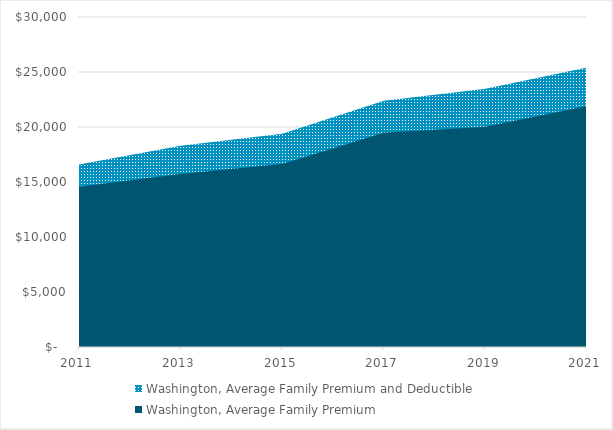
| Category | United States, Average Family Premium and Deductible | Alabama, Average Family Premium and Deductible | Alaska, Average Family Premium and Deductible | Arizona, Average Family Premium and Deductible | Arkansas, Average Family Premium and Deductible | California, Average Family Premium and Deductible | Colorado, Average Family Premium and Deductible | Connecticut, Average Family Premium and Deductible | Delaware, Average Family Premium and Deductible | District of Columbia, Average Family Premium and Deductible | Florida, Average Family Premium and Deductible | Georgia, Average Family Premium and Deductible | Hawaii, Average Family Premium and Deductible | Idaho, Average Family Premium and Deductible | Illinois, Average Family Premium and Deductible | Indiana, Average Family Premium and Deductible | Iowa, Average Family Premium and Deductible | Kansas, Average Family Premium and Deductible | Kentucky, Average Family Premium and Deductible | Louisiana, Average Family Premium and Deductible | Maine, Average Family Premium and Deductible | Maryland, Average Family Premium and Deductible | Massachusetts, Average Family Premium and Deductible | Michigan, Average Family Premium and Deductible | Minnesota, Average Family Premium and Deductible | Mississippi, Average Family Premium and Deductible | Missouri, Average Family Premium and Deductible | Montana, Average Family Premium and Deductible | Nebraska, Average Family Premium and Deductible | Nevada, Average Family Premium and Deductible | New Hampshire, Average Family Premium and Deductible | New Jersey, Average Family Premium and Deductible | New Mexico, Average Family Premium and Deductible | New York, Average Family Premium and Deductible | North Carolina, Average Family Premium and Deductible | North Dakota, Average Family Premium and Deductible | Ohio, Average Family Premium and Deductible | Oklahoma, Average Family Premium and Deductible | Oregon, Average Family Premium and Deductible | Pennsylvania, Average Family Premium and Deductible | Rhode Island, Average Family Premium and Deductible | South Carolina, Average Family Premium and Deductible | South Dakota, Average Family Premium and Deductible | Tennessee, Average Family Premium and Deductible | Texas, Average Family Premium and Deductible | Utah, Average Family Premium and Deductible | Vermont, Average Family Premium and Deductible | Virginia, Average Family Premium and Deductible | Washington, Average Family Premium and Deductible | West Virginia, Average Family Premium and Deductible | Wisconsin, Average Family Premium and Deductible | Wyoming, Average Family Premium and Deductible | United States, Average Family Premium | Alabama, Average Family Premium | Alaska, Average Family Premium | Arizona, Average Family Premium | Arkansas, Average Family Premium | California, Average Family Premium | Colorado, Average Family Premium | Connecticut, Average Family Premium | Delaware, Average Family Premium | District of Columbia, Average Family Premium | Florida, Average Family Premium | Georgia, Average Family Premium | Hawaii, Average Family Premium | Idaho, Average Family Premium | Illinois, Average Family Premium | Indiana, Average Family Premium | Iowa, Average Family Premium | Kansas, Average Family Premium | Kentucky, Average Family Premium | Louisiana, Average Family Premium | Maine, Average Family Premium | Maryland, Average Family Premium | Massachusetts, Average Family Premium | Michigan, Average Family Premium | Minnesota, Average Family Premium | Mississippi, Average Family Premium | Missouri, Average Family Premium | Montana, Average Family Premium | Nebraska, Average Family Premium | Nevada, Average Family Premium | New Hampshire, Average Family Premium | New Jersey, Average Family Premium | New Mexico, Average Family Premium | New York, Average Family Premium | North Carolina, Average Family Premium | North Dakota, Average Family Premium | Ohio, Average Family Premium | Oklahoma, Average Family Premium | Oregon, Average Family Premium | Pennsylvania, Average Family Premium | Rhode Island, Average Family Premium | South Carolina, Average Family Premium | South Dakota, Average Family Premium | Tennessee, Average Family Premium | Texas, Average Family Premium | Utah, Average Family Premium | Vermont, Average Family Premium | Virginia, Average Family Premium | Washington, Average Family Premium | West Virginia, Average Family Premium | Wisconsin, Average Family Premium | Wyoming, Average Family Premium |
|---|---|---|---|---|---|---|---|---|---|---|---|---|---|---|---|---|---|---|---|---|---|---|---|---|---|---|---|---|---|---|---|---|---|---|---|---|---|---|---|---|---|---|---|---|---|---|---|---|---|---|---|---|---|---|---|---|---|---|---|---|---|---|---|---|---|---|---|---|---|---|---|---|---|---|---|---|---|---|---|---|---|---|---|---|---|---|---|---|---|---|---|---|---|---|---|---|---|---|---|---|---|---|---|---|
| 2011.0 |  |  |  |  |  |  |  |  |  |  |  |  |  |  |  |  |  |  |  |  |  |  |  |  |  |  |  |  |  |  |  |  |  |  |  |  |  |  |  |  |  |  |  |  |  |  |  |  | 16580 |  |  |  |  |  |  |  |  |  |  |  |  |  |  |  |  |  |  |  |  |  |  |  |  |  |  |  |  |  |  |  |  |  |  |  |  |  |  |  |  |  |  |  |  |  |  |  |  |  |  |  | 14559 |  |  |  |
| 2013.0 |  |  |  |  |  |  |  |  |  |  |  |  |  |  |  |  |  |  |  |  |  |  |  |  |  |  |  |  |  |  |  |  |  |  |  |  |  |  |  |  |  |  |  |  |  |  |  |  | 18292 |  |  |  |  |  |  |  |  |  |  |  |  |  |  |  |  |  |  |  |  |  |  |  |  |  |  |  |  |  |  |  |  |  |  |  |  |  |  |  |  |  |  |  |  |  |  |  |  |  |  |  | 15721 |  |  |  |
| 2015.0 |  |  |  |  |  |  |  |  |  |  |  |  |  |  |  |  |  |  |  |  |  |  |  |  |  |  |  |  |  |  |  |  |  |  |  |  |  |  |  |  |  |  |  |  |  |  |  |  | 19378 |  |  |  |  |  |  |  |  |  |  |  |  |  |  |  |  |  |  |  |  |  |  |  |  |  |  |  |  |  |  |  |  |  |  |  |  |  |  |  |  |  |  |  |  |  |  |  |  |  |  |  | 16627 |  |  |  |
| 2017.0 |  |  |  |  |  |  |  |  |  |  |  |  |  |  |  |  |  |  |  |  |  |  |  |  |  |  |  |  |  |  |  |  |  |  |  |  |  |  |  |  |  |  |  |  |  |  |  |  | 22392 |  |  |  |  |  |  |  |  |  |  |  |  |  |  |  |  |  |  |  |  |  |  |  |  |  |  |  |  |  |  |  |  |  |  |  |  |  |  |  |  |  |  |  |  |  |  |  |  |  |  |  | 19472 |  |  |  |
| 2019.0 |  |  |  |  |  |  |  |  |  |  |  |  |  |  |  |  |  |  |  |  |  |  |  |  |  |  |  |  |  |  |  |  |  |  |  |  |  |  |  |  |  |  |  |  |  |  |  |  | 23468 |  |  |  |  |  |  |  |  |  |  |  |  |  |  |  |  |  |  |  |  |  |  |  |  |  |  |  |  |  |  |  |  |  |  |  |  |  |  |  |  |  |  |  |  |  |  |  |  |  |  |  | 20033 |  |  |  |
| 2021.0 |  |  |  |  |  |  |  |  |  |  |  |  |  |  |  |  |  |  |  |  |  |  |  |  |  |  |  |  |  |  |  |  |  |  |  |  |  |  |  |  |  |  |  |  |  |  |  |  | 25416 |  |  |  |  |  |  |  |  |  |  |  |  |  |  |  |  |  |  |  |  |  |  |  |  |  |  |  |  |  |  |  |  |  |  |  |  |  |  |  |  |  |  |  |  |  |  |  |  |  |  |  | 21914 |  |  |  |